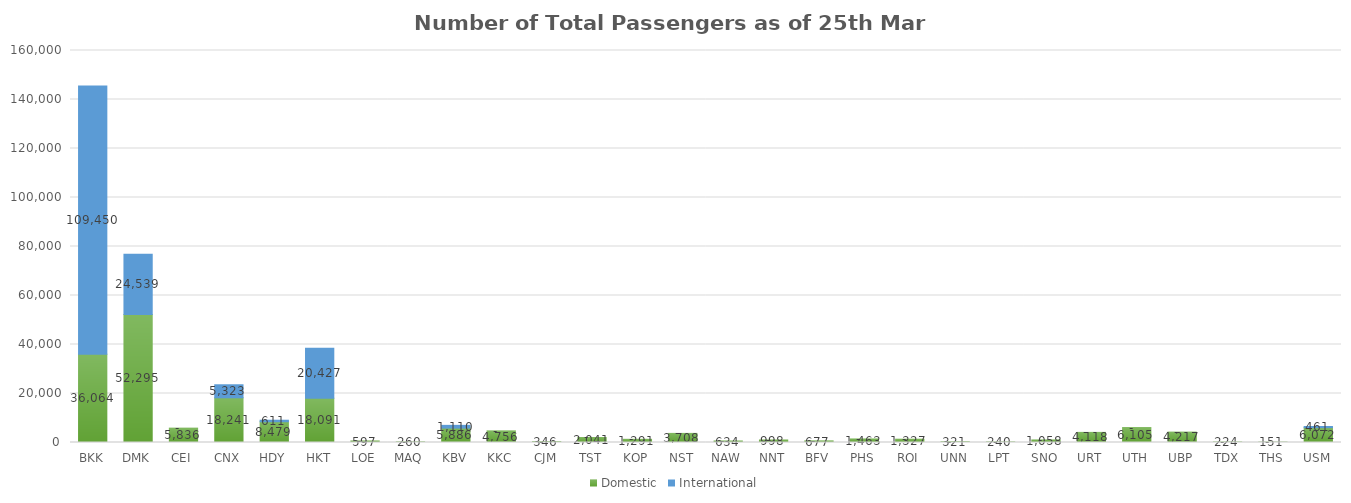
| Category | Domestic | International |
|---|---|---|
| BKK | 36064 | 109450 |
| DMK | 52295 | 24539 |
| CEI | 5836 | 0 |
| CNX | 18241 | 5323 |
| HDY | 8479 | 611 |
| HKT | 18091 | 20427 |
| LOE | 597 | 0 |
| MAQ | 260 | 0 |
| KBV | 5886 | 1110 |
| KKC | 4756 | 0 |
| CJM | 346 | 0 |
| TST | 2041 | 0 |
| KOP | 1291 | 0 |
| NST | 3708 | 0 |
| NAW | 634 | 0 |
| NNT | 998 | 0 |
| BFV | 677 | 0 |
| PHS | 1463 | 0 |
| ROI | 1327 | 0 |
| UNN | 321 | 0 |
| LPT | 240 | 0 |
| SNO | 1058 | 0 |
| URT | 4118 | 0 |
| UTH | 6105 | 0 |
| UBP | 4217 | 0 |
| TDX | 224 | 0 |
| THS | 151 | 0 |
| USM | 6072 | 461 |